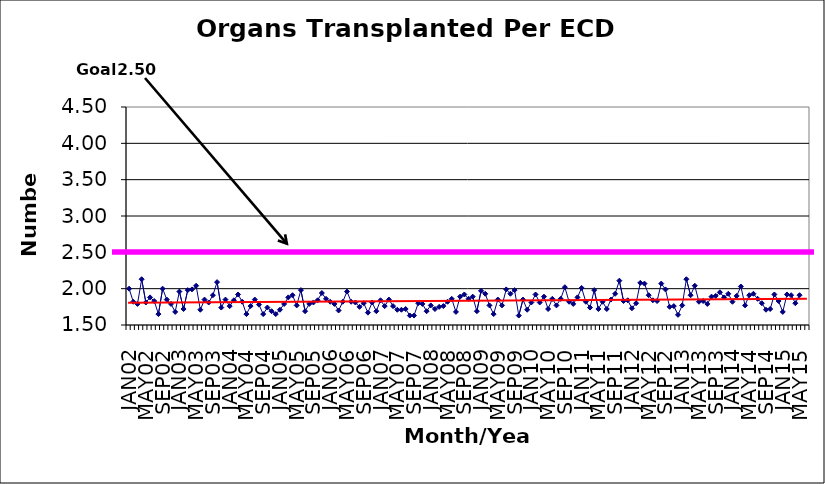
| Category | Series 0 |
|---|---|
| JAN02 | 2 |
| FEB02 | 1.82 |
| MAR02 | 1.79 |
| APR02 | 2.13 |
| MAY02 | 1.81 |
| JUN02 | 1.88 |
| JUL02 | 1.83 |
| AUG02 | 1.65 |
| SEP02 | 2 |
| OCT02 | 1.85 |
| NOV02 | 1.79 |
| DEC02 | 1.68 |
| JAN03 | 1.96 |
| FEB03 | 1.72 |
| MAR03 | 1.98 |
| APR03 | 1.99 |
| MAY03 | 2.04 |
| JUN03 | 1.71 |
| JUL03 | 1.85 |
| AUG03 | 1.81 |
| SEP03 | 1.91 |
| OCT03 | 2.09 |
| NOV03 | 1.74 |
| DEC03 | 1.85 |
| JAN04 | 1.76 |
| FEB04 | 1.84 |
| MAR04 | 1.92 |
| APR04 | 1.82 |
| MAY04 | 1.65 |
| JUN04 | 1.76 |
| JUL04 | 1.85 |
| AUG04 | 1.78 |
| SEP04 | 1.65 |
| OCT04 | 1.74 |
| NOV04 | 1.69 |
| DEC04 | 1.65 |
| JAN05 | 1.71 |
| FEB05 | 1.79 |
| MAR05 | 1.88 |
| APR05 | 1.91 |
| MAY05 | 1.77 |
| JUN05 | 1.98 |
| JUL05 | 1.69 |
| AUG05 | 1.79 |
| SEP05 | 1.81 |
| OCT05 | 1.84 |
| NOV05 | 1.94 |
| DEC05 | 1.86 |
| JAN06 | 1.82 |
| FEB06 | 1.79 |
| MAR06 | 1.7 |
| APR06 | 1.82 |
| MAY06 | 1.96 |
| JUN06 | 1.82 |
| JUL06 | 1.81 |
| AUG06 | 1.75 |
| SEP06 | 1.8 |
| OCT06 | 1.67 |
| NOV06 | 1.81 |
| DEC06 | 1.69 |
| JAN07 | 1.84 |
| FEB07 | 1.76 |
| MAR07 | 1.85 |
| APR07 | 1.76 |
| MAY07 | 1.71 |
| JUN07 | 1.71 |
| JUL07 | 1.72 |
| AUG07 | 1.63 |
| SEP07 | 1.63 |
| OCT07 | 1.8 |
| NOV07 | 1.79 |
| DEC07 | 1.69 |
| JAN08 | 1.77 |
| FEB08 | 1.72 |
| MAR08 | 1.75 |
| APR08 | 1.76 |
| MAY08 | 1.82 |
| JUN08 | 1.86 |
| JUL08 | 1.68 |
| AUG08 | 1.89 |
| SEP08 | 1.92 |
| OCT08 | 1.86 |
| NOV08 | 1.89 |
| DEC08 | 1.69 |
| JAN09 | 1.97 |
| FEB09 | 1.93 |
| MAR09 | 1.77 |
| APR09 | 1.65 |
| MAY09 | 1.85 |
| JUN09 | 1.77 |
| JUL09 | 1.99 |
| AUG09 | 1.93 |
| SEP09 | 1.98 |
| OCT09 | 1.63 |
| NOV09 | 1.85 |
| DEC09 | 1.71 |
| JAN10 | 1.81 |
| FEB10 | 1.92 |
| MAR10 | 1.81 |
| APR10 | 1.89 |
| MAY10 | 1.72 |
| JUN10 | 1.86 |
| JUL10 | 1.77 |
| AUG10 | 1.86 |
| SEP10 | 2.02 |
| OCT10 | 1.82 |
| NOV10 | 1.79 |
| DEC10 | 1.88 |
| JAN11 | 2.01 |
| FEB11 | 1.82 |
| MAR11 | 1.74 |
| APR11 | 1.98 |
| MAY11 | 1.72 |
| JUN11 | 1.82 |
| JUL11 | 1.72 |
| AUG11 | 1.85 |
| SEP11 | 1.93 |
| OCT11 | 2.11 |
| NOV11 | 1.83 |
| DEC11 | 1.84 |
| JAN12 | 1.73 |
| FEB12 | 1.8 |
| MAR12 | 2.08 |
| APR12 | 2.07 |
| MAY12 | 1.91 |
| JUN12 | 1.84 |
| JUL12 | 1.83 |
| AUG12 | 2.07 |
| SEP12 | 1.99 |
| OCT12 | 1.75 |
| NOV12 | 1.76 |
| DEC12 | 1.64 |
| JAN13 | 1.77 |
| FEB13 | 2.13 |
| MAR13 | 1.91 |
| APR13 | 2.04 |
| MAY13 | 1.82 |
| JUN13 | 1.83 |
| JUL13 | 1.79 |
| AUG13 | 1.89 |
| SEP13 | 1.9 |
| OCT13 | 1.95 |
| NOV13 | 1.88 |
| DEC13 | 1.93 |
| JAN14 | 1.82 |
| FEB14 | 1.9 |
| MAR14 | 2.03 |
| APR14 | 1.77 |
| MAY14 | 1.91 |
| JUN14 | 1.93 |
| JUL14 | 1.86 |
| AUG14 | 1.8 |
| SEP14 | 1.71 |
| OCT14 | 1.72 |
| NOV14 | 1.92 |
| DEC14 | 1.83 |
| JAN15 | 1.68 |
| FEB15 | 1.92 |
| MAR15 | 1.91 |
| APR15 | 1.8 |
| MAY15 | 1.91 |